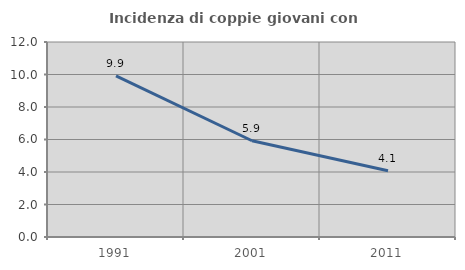
| Category | Incidenza di coppie giovani con figli |
|---|---|
| 1991.0 | 9.921 |
| 2001.0 | 5.923 |
| 2011.0 | 4.076 |